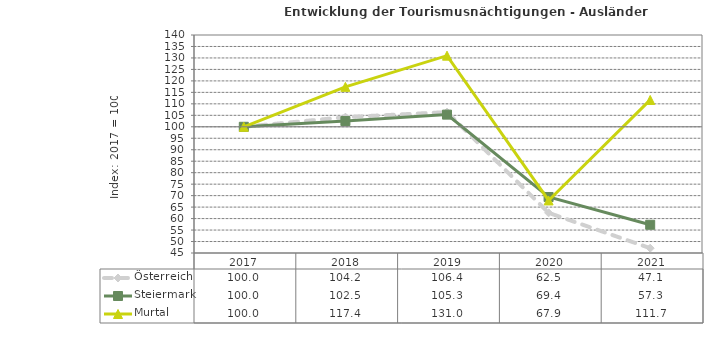
| Category | Österreich | Steiermark | Murtal |
|---|---|---|---|
| 2021.0 | 47.1 | 57.3 | 111.7 |
| 2020.0 | 62.5 | 69.4 | 67.9 |
| 2019.0 | 106.4 | 105.3 | 131 |
| 2018.0 | 104.2 | 102.5 | 117.4 |
| 2017.0 | 100 | 100 | 100 |